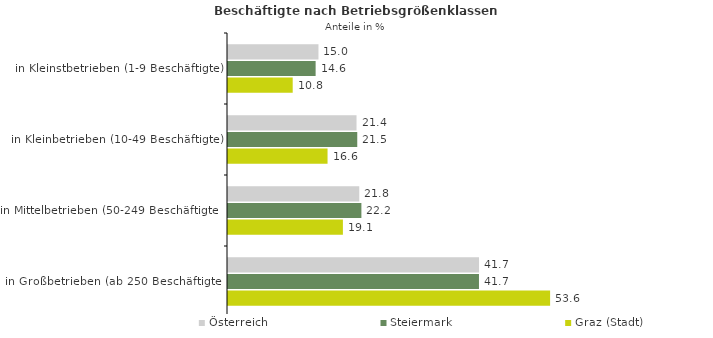
| Category | Österreich | Steiermark | Graz (Stadt) |
|---|---|---|---|
| in Kleinstbetrieben (1-9 Beschäftigte) | 15.046 | 14.574 | 10.761 |
| in Kleinbetrieben (10-49 Beschäftigte) | 21.375 | 21.498 | 16.557 |
| in Mittelbetrieben (50-249 Beschäftigte) | 21.831 | 22.187 | 19.111 |
| in Großbetrieben (ab 250 Beschäftigte) | 41.748 | 41.742 | 53.572 |